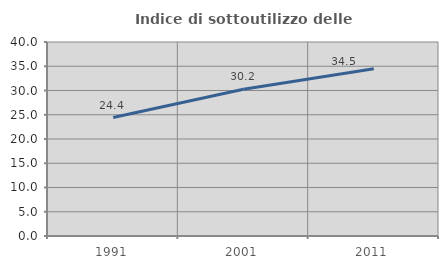
| Category | Indice di sottoutilizzo delle abitazioni  |
|---|---|
| 1991.0 | 24.426 |
| 2001.0 | 30.245 |
| 2011.0 | 34.498 |